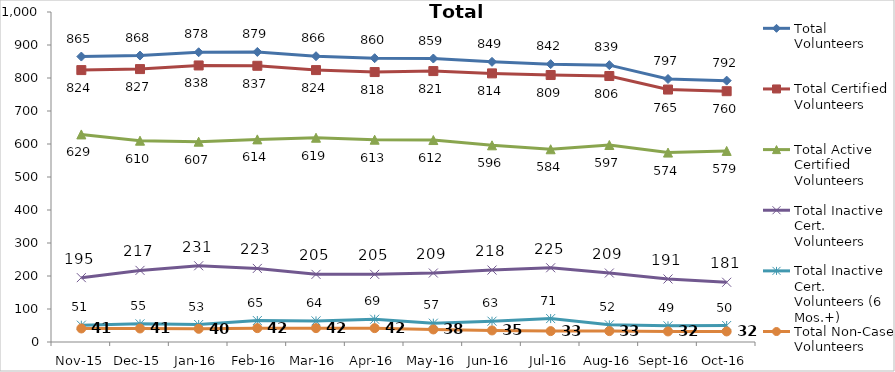
| Category | Total Volunteers | Total Certified Volunteers | Total Active Certified Volunteers | Total Inactive Cert. Volunteers | Total Inactive Cert. Volunteers (6 Mos.+) | Total Non-Case Volunteers |
|---|---|---|---|---|---|---|
| Nov-15 | 865 | 824 | 629 | 195 | 51 | 41 |
| Dec-15 | 868 | 827 | 610 | 217 | 55 | 41 |
| Jan-16 | 878 | 838 | 607 | 231 | 53 | 40 |
| Feb-16 | 879 | 837 | 614 | 223 | 65 | 42 |
| Mar-16 | 866 | 824 | 619 | 205 | 64 | 42 |
| Apr-16 | 860 | 818 | 613 | 205 | 69 | 42 |
| May-16 | 859 | 821 | 612 | 209 | 57 | 38 |
| Jun-16 | 849 | 814 | 596 | 218 | 63 | 35 |
| Jul-16 | 842 | 809 | 584 | 225 | 71 | 33 |
| Aug-16 | 839 | 806 | 597 | 209 | 52 | 33 |
| Sep-16 | 797 | 765 | 574 | 191 | 49 | 32 |
| Oct-16 | 792 | 760 | 579 | 181 | 50 | 32 |